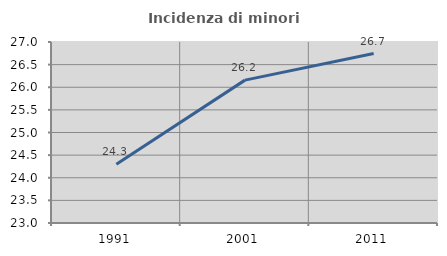
| Category | Incidenza di minori stranieri |
|---|---|
| 1991.0 | 24.299 |
| 2001.0 | 26.157 |
| 2011.0 | 26.744 |